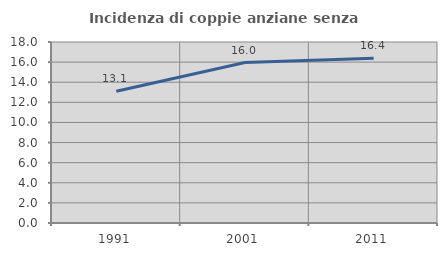
| Category | Incidenza di coppie anziane senza figli  |
|---|---|
| 1991.0 | 13.101 |
| 2001.0 | 15.953 |
| 2011.0 | 16.39 |